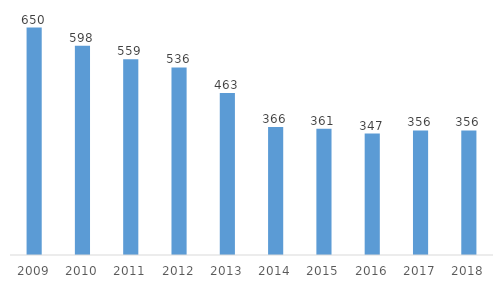
| Category | Series 0 |
|---|---|
| 2009.0 | 650 |
| 2010.0 | 598 |
| 2011.0 | 559 |
| 2012.0 | 536 |
| 2013.0 | 463 |
| 2014.0 | 366 |
| 2015.0 | 361 |
| 2016.0 | 347 |
| 2017.0 | 356 |
| 2018.0 | 356 |